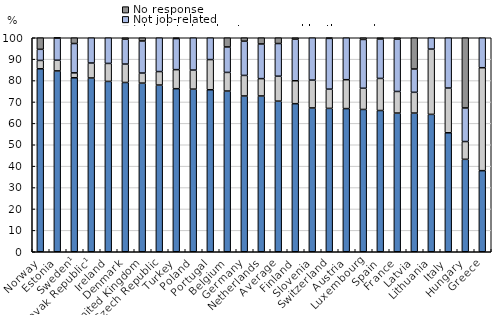
| Category | Job-related and sponsored by the employer | Job-related and not sponsored by the employer | Not job-related | No response |
|---|---|---|---|---|
| Norway | 85.5 | 3.9 | 5.2 | 5.4 |
| Estonia | 84.5 | 5 | 10.4 | 0.1 |
| Sweden¹ | 81.3 | 2.3 | 13.7 | 2.7 |
| Slovak Republic¹ | 81.2 | 7 | 11.8 | 0 |
| Ireland | 79.6 | 8.4 | 12 | 0 |
| Denmark | 79.1 | 8.6 | 11.6 | 0.7 |
| United Kingdom | 78.8 | 4.7 | 15 | 1.5 |
| Czech Republic | 77.9 | 6.3 | 15.8 | 0 |
| Turkey | 76.2 | 8.9 | 14.5 | 0.4 |
| Poland | 76 | 8.9 | 15.1 | 0 |
| Portugal | 75.7 | 14.1 | 10.2 | 0 |
| Belgium | 75.1 | 8.7 | 11.9 | 4.3 |
| Germany | 72.8 | 9.6 | 16 | 1.6 |
| Netherlands | 72.8 | 8.1 | 16.2 | 2.9 |
| Average | 70.377 | 11.662 | 15.265 | 2.696 |
| Finland | 69.2 | 10.7 | 19.4 | 0.7 |
| Slovenia | 67.2 | 13 | 19.8 | 0 |
| Switzerland | 67 | 9 | 23.7 | 0.3 |
| Austria | 66.9 | 13.5 | 19.6 | 0 |
| Luxembourg | 66.5 | 9.9 | 22.8 | 0.8 |
| Spain | 66 | 15 | 18.4 | 0.6 |
| France | 64.8 | 10.1 | 24.4 | 0.7 |
| Latvia | 64.8 | 9.7 | 10.9 | 14.6 |
| Lithuania | 64.2 | 30.5 | 5.3 | 0 |
| Italy | 55.6 | 20.9 | 23.5 | 0 |
| Hungary | 43.2 | 8.3 | 15.7 | 32.8 |
| Greece | 37.9 | 48.1 | 14 | 0 |